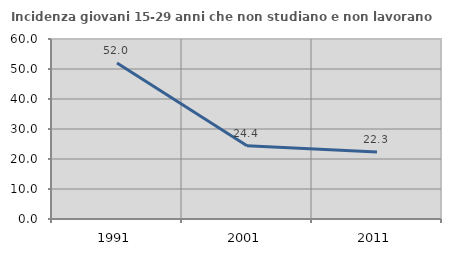
| Category | Incidenza giovani 15-29 anni che non studiano e non lavorano  |
|---|---|
| 1991.0 | 51.972 |
| 2001.0 | 24.39 |
| 2011.0 | 22.335 |